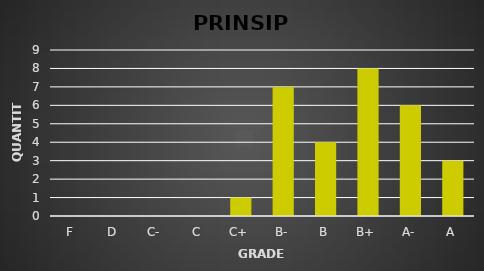
| Category | Series 0 |
|---|---|
| F | 0 |
| D | 0 |
| C- | 0 |
| C | 0 |
| C+ | 1 |
| B- | 7 |
| B | 4 |
| B+ | 8 |
| A- | 6 |
| A | 3 |